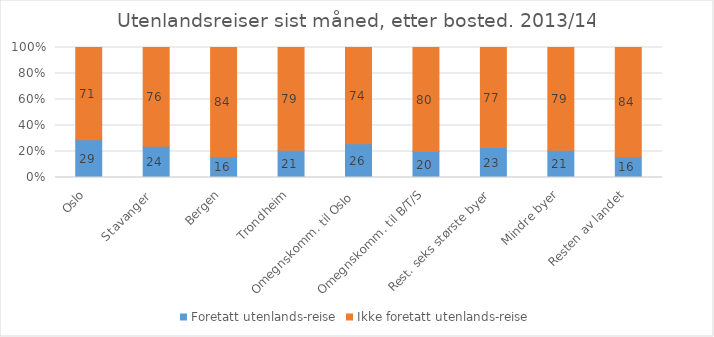
| Category | Foretatt utenlands-reise | Ikke foretatt utenlands-reise |
|---|---|---|
| Oslo | 29 | 71 |
| Stavanger  | 24 | 76 |
| Bergen | 16 | 84 |
| Trondheim | 21 | 79 |
| Omegnskomm. til Oslo  | 26 | 74 |
| Omegnskomm. til B/T/S | 20 | 80 |
| Rest. seks største byer | 23 | 77 |
| Mindre byer | 21 | 79 |
| Resten av landet | 16 | 84 |